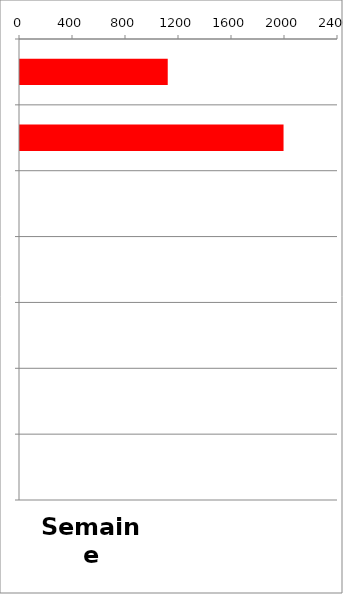
| Category | TV |
|---|---|
| 0 | 1115 |
| 1 | 1989 |
| 2 | 0 |
| 3 | 0 |
| 4 | 0 |
| 5 | 0 |
| 6 | 0 |